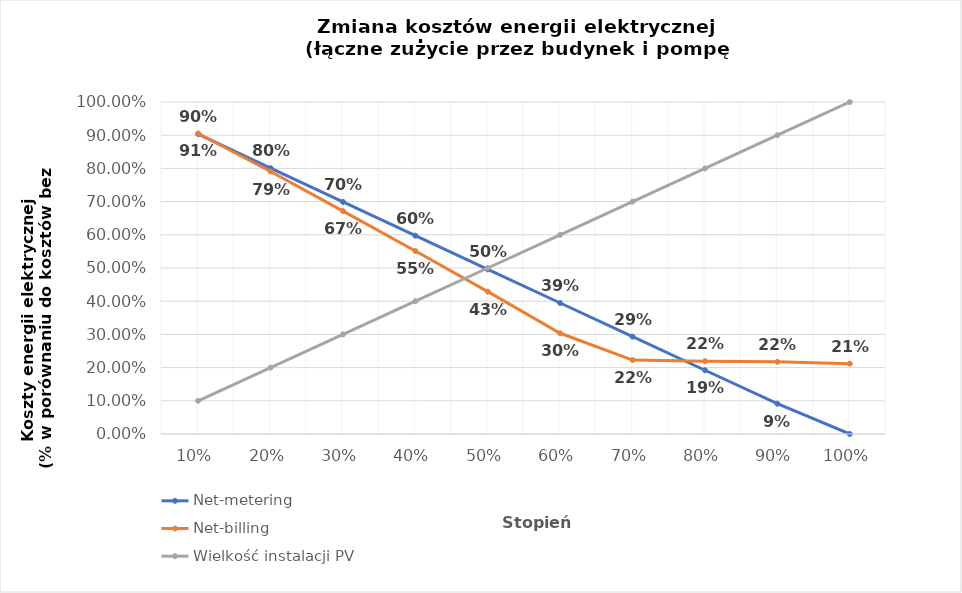
| Category | Net-metering | Net-billing | Wielkość instalacji PV |
|---|---|---|---|
| 0.1 | 0.903 | 0.905 | 0.1 |
| 0.2 | 0.801 | 0.791 | 0.2 |
| 0.3 | 0.699 | 0.671 | 0.3 |
| 0.4 | 0.597 | 0.551 | 0.4 |
| 0.5 | 0.496 | 0.429 | 0.5 |
| 0.6 | 0.395 | 0.303 | 0.6 |
| 0.7 | 0.293 | 0.223 | 0.7 |
| 0.8 | 0.192 | 0.219 | 0.8 |
| 0.9 | 0.091 | 0.217 | 0.9 |
| 1.0 | 0 | 0.212 | 1 |